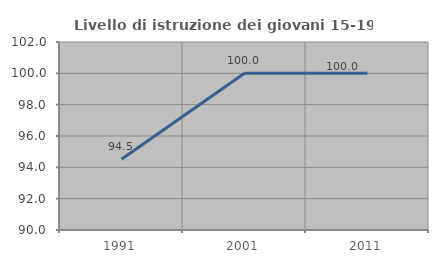
| Category | Livello di istruzione dei giovani 15-19 anni |
|---|---|
| 1991.0 | 94.521 |
| 2001.0 | 100 |
| 2011.0 | 100 |